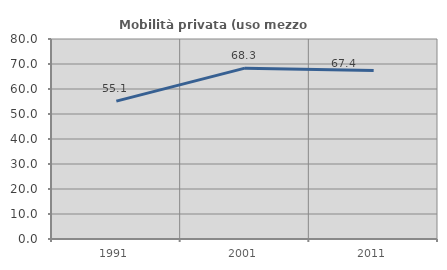
| Category | Mobilità privata (uso mezzo privato) |
|---|---|
| 1991.0 | 55.143 |
| 2001.0 | 68.35 |
| 2011.0 | 67.434 |